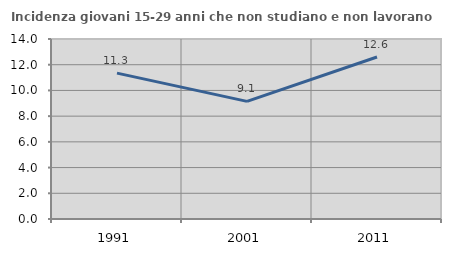
| Category | Incidenza giovani 15-29 anni che non studiano e non lavorano  |
|---|---|
| 1991.0 | 11.348 |
| 2001.0 | 9.146 |
| 2011.0 | 12.6 |